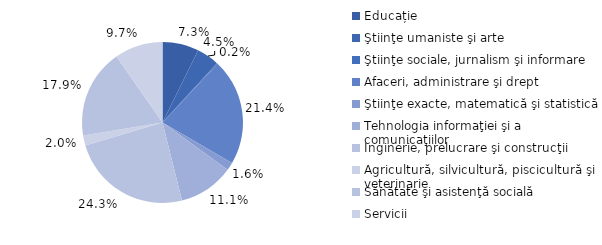
| Category | Series 0 |
|---|---|
| Educație | 7.3 |
| Ştiinţe umaniste şi arte | 4.5 |
| Ştiinţe sociale, jurnalism şi informare | 0.2 |
| Afaceri, administrare şi drept | 21.4 |
| Ştiinţe exacte, matematică şi statistică | 1.6 |
| Tehnologia informaţiei şi a comunicaţiilor | 11.1 |
| Inginerie, prelucrare şi construcţii | 24.3 |
| Agricultură, silvicultură, piscicultură şi veterinarie | 2 |
| Sănătate şi asistenţă socială | 17.9 |
| Servicii | 9.7 |